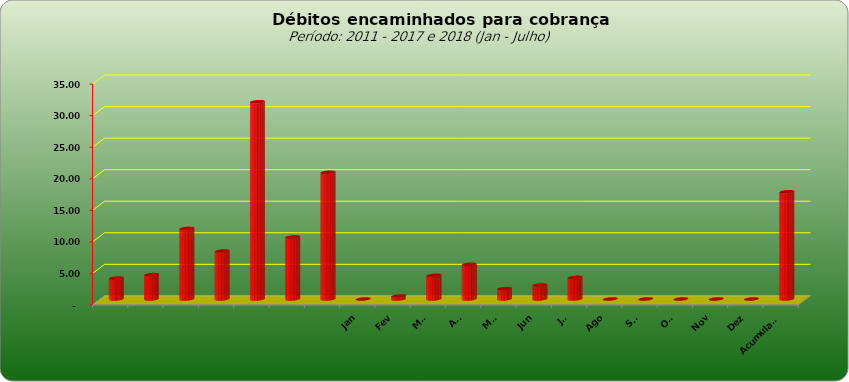
| Category |  3.309.443,02  |
|---|---|
|  | 3309443.02 |
|  | 3859728.44 |
|  | 11181928.25 |
|  | 7600526.01 |
|  | 31248623.5 |
|  | 9830198.34 |
|  | 20083556.95 |
| Jan | 0 |
| Fev | 468831.1 |
| Mar | 3741527.45 |
| Abr | 5493663.59 |
| Mai | 1643658.45 |
| Jun | 2215524.43 |
| Jul | 3425456.07 |
| Ago | 0 |
| Set | 0 |
| Out | 0 |
| Nov | 0 |
| Dez | 0 |
| Acumulado | 16988661.09 |